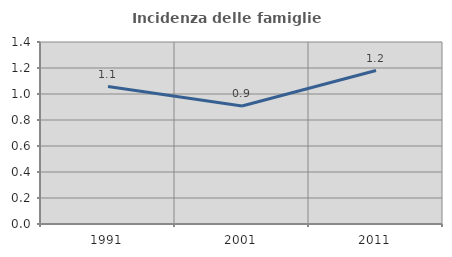
| Category | Incidenza delle famiglie numerose |
|---|---|
| 1991.0 | 1.057 |
| 2001.0 | 0.907 |
| 2011.0 | 1.181 |